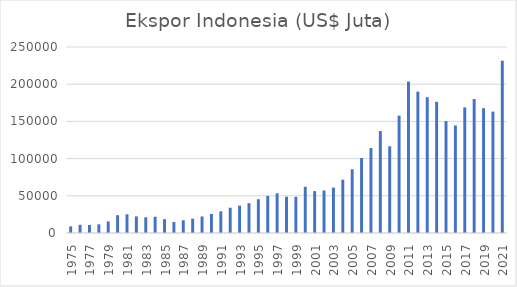
| Category | Ekspor Indonesia (US$ Juta) |
|---|---|
| 1975.0 | 8894.2 |
| 1976.0 | 11088.9 |
| 1977.0 | 10852.6 |
| 1978.0 | 11643.2 |
| 1979.0 | 15590.1 |
| 1980.0 | 23950.4 |
| 1981.0 | 25164.5 |
| 1982.0 | 22328.3 |
| 1983.0 | 21145.9 |
| 1984.0 | 21887.8 |
| 1985.0 | 18586.7 |
| 1986.0 | 14805 |
| 1987.0 | 17135.6 |
| 1988.0 | 19218.5 |
| 1989.0 | 22158.9 |
| 1990.0 | 25675.3 |
| 1991.0 | 29142.4 |
| 1992.0 | 33967 |
| 1993.0 | 36823 |
| 1994.0 | 40053.3 |
| 1995.0 | 45418.2 |
| 1996.0 | 49814.7 |
| 1997.0 | 53443.6 |
| 1998.0 | 48847.6 |
| 1999.0 | 48665.5 |
| 2000.0 | 62124 |
| 2001.0 | 56323.2 |
| 2002.0 | 57105.8 |
| 2003.0 | 61034.5 |
| 2004.0 | 71584.6 |
| 2005.0 | 85659.9 |
| 2006.0 | 100798.6 |
| 2007.0 | 114101 |
| 2008.0 | 137020.4 |
| 2009.0 | 116510 |
| 2010.0 | 157779 |
| 2011.0 | 203496.6 |
| 2012.0 | 190031.8 |
| 2013.0 | 182551.9 |
| 2014.0 | 176292.6 |
| 2015.0 | 150393.3 |
| 2016.0 | 144489.7 |
| 2017.0 | 168828.2 |
| 2018.0 | 180012.7 |
| 2019.0 | 167683 |
| 2020.0 | 163192 |
| 2021.0 | 231609.5 |